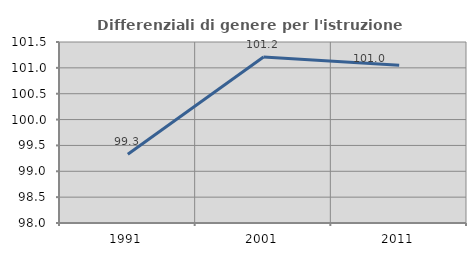
| Category | Differenziali di genere per l'istruzione superiore |
|---|---|
| 1991.0 | 99.329 |
| 2001.0 | 101.209 |
| 2011.0 | 101.05 |